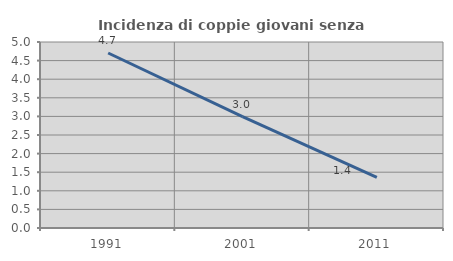
| Category | Incidenza di coppie giovani senza figli |
|---|---|
| 1991.0 | 4.704 |
| 2001.0 | 2.996 |
| 2011.0 | 1.364 |